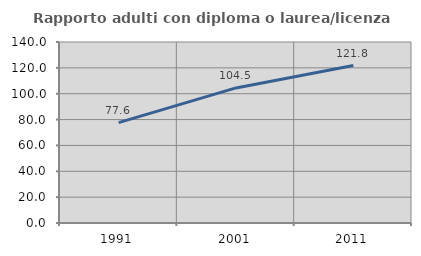
| Category | Rapporto adulti con diploma o laurea/licenza media  |
|---|---|
| 1991.0 | 77.63 |
| 2001.0 | 104.492 |
| 2011.0 | 121.798 |